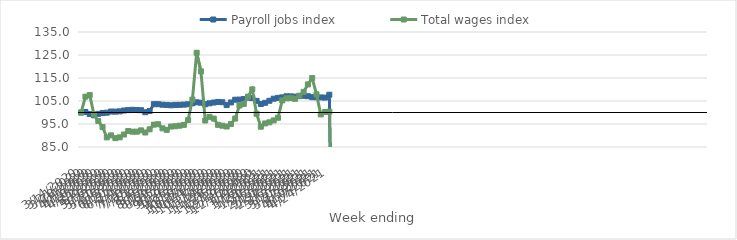
| Category | Payroll jobs index | Total wages index |
|---|---|---|
| 14/03/2020 | 100 | 100 |
| 21/03/2020 | 100.218 | 106.893 |
| 28/03/2020 | 99.308 | 107.599 |
| 04/04/2020 | 98.777 | 99.153 |
| 11/04/2020 | 99.416 | 96.34 |
| 18/04/2020 | 99.755 | 93.666 |
| 25/04/2020 | 99.924 | 89.173 |
| 02/05/2020 | 100.419 | 90.056 |
| 09/05/2020 | 100.376 | 88.84 |
| 16/05/2020 | 100.501 | 89.2 |
| 23/05/2020 | 100.864 | 90.422 |
| 30/05/2020 | 101.04 | 91.939 |
| 06/06/2020 | 101.163 | 91.665 |
| 13/06/2020 | 101.067 | 91.662 |
| 20/06/2020 | 100.997 | 92.23 |
| 27/06/2020 | 100.11 | 91.298 |
| 04/07/2020 | 100.655 | 92.678 |
| 11/07/2020 | 103.61 | 94.734 |
| 18/07/2020 | 103.608 | 94.9 |
| 25/07/2020 | 103.384 | 93.123 |
| 01/08/2020 | 103.291 | 92.464 |
| 08/08/2020 | 103.136 | 93.893 |
| 15/08/2020 | 103.315 | 94.022 |
| 22/08/2020 | 103.345 | 94.27 |
| 29/08/2020 | 103.424 | 94.628 |
| 05/09/2020 | 103.569 | 96.701 |
| 12/09/2020 | 104.01 | 105.606 |
| 19/09/2020 | 104.427 | 125.982 |
| 26/09/2020 | 104.254 | 117.875 |
| 03/10/2020 | 103.584 | 96.524 |
| 10/10/2020 | 103.995 | 98.115 |
| 17/10/2020 | 104.338 | 97.338 |
| 24/10/2020 | 104.593 | 94.641 |
| 31/10/2020 | 104.465 | 94.263 |
| 07/11/2020 | 103.222 | 93.908 |
| 14/11/2020 | 104.368 | 94.987 |
| 21/11/2020 | 105.564 | 97.359 |
| 28/11/2020 | 105.609 | 103.02 |
| 05/12/2020 | 105.816 | 103.701 |
| 12/12/2020 | 106.458 | 106.915 |
| 19/12/2020 | 106.277 | 110.053 |
| 26/12/2020 | 105.06 | 99.455 |
| 02/01/2021 | 103.685 | 93.83 |
| 09/01/2021 | 104.209 | 95.25 |
| 16/01/2021 | 105.098 | 95.73 |
| 23/01/2021 | 106.001 | 96.558 |
| 30/01/2021 | 106.369 | 97.718 |
| 06/02/2021 | 106.589 | 105.263 |
| 13/02/2021 | 107.05 | 106.163 |
| 20/02/2021 | 107.009 | 106.263 |
| 27/02/2021 | 106.894 | 105.952 |
| 06/03/2021 | 107.116 | 107.302 |
| 13/03/2021 | 107.257 | 108.969 |
| 20/03/2021 | 107.076 | 112.209 |
| 27/03/2021 | 106.651 | 114.963 |
| 03/04/2021 | 106.624 | 107.901 |
| 10/04/2021 | 106.55 | 99.166 |
| 17/04/2021 | 106.48 | 100.215 |
| 24/04/2021 | 107.725 | 100.38 |